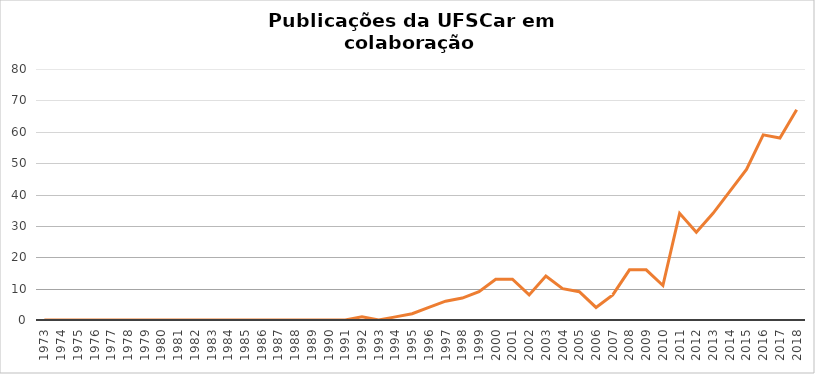
| Category | # Records |
|---|---|
| 2018.0 | 67 |
| 2017.0 | 58 |
| 2016.0 | 59 |
| 2015.0 | 48 |
| 2014.0 | 41 |
| 2013.0 | 34 |
| 2012.0 | 28 |
| 2011.0 | 34 |
| 2010.0 | 11 |
| 2009.0 | 16 |
| 2008.0 | 16 |
| 2007.0 | 8 |
| 2006.0 | 4 |
| 2005.0 | 9 |
| 2004.0 | 10 |
| 2003.0 | 14 |
| 2002.0 | 8 |
| 2001.0 | 13 |
| 2000.0 | 13 |
| 1999.0 | 9 |
| 1998.0 | 7 |
| 1997.0 | 6 |
| 1996.0 | 4 |
| 1995.0 | 2 |
| 1994.0 | 1 |
| 1993.0 | 0 |
| 1992.0 | 1 |
| 1991.0 | 0 |
| 1990.0 | 0 |
| 1989.0 | 0 |
| 1988.0 | 0 |
| 1987.0 | 0 |
| 1986.0 | 0 |
| 1985.0 | 0 |
| 1984.0 | 0 |
| 1983.0 | 0 |
| 1982.0 | 0 |
| 1981.0 | 0 |
| 1980.0 | 0 |
| 1979.0 | 0 |
| 1978.0 | 0 |
| 1977.0 | 0 |
| 1976.0 | 0 |
| 1975.0 | 0 |
| 1974.0 | 0 |
| 1973.0 | 0 |